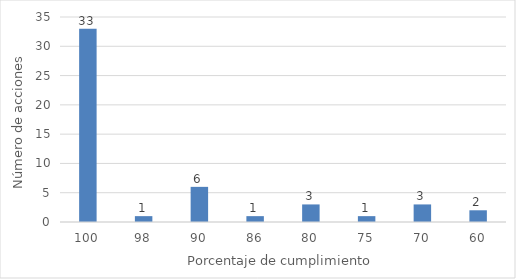
| Category | Series 0 |
|---|---|
| 100.0 | 33 |
| 98.0 | 1 |
| 90.0 | 6 |
| 86.0 | 1 |
| 80.0 | 3 |
| 75.0 | 1 |
| 70.0 | 3 |
| 60.0 | 2 |